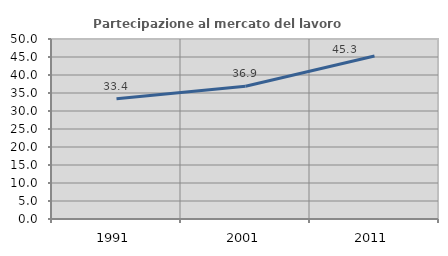
| Category | Partecipazione al mercato del lavoro  femminile |
|---|---|
| 1991.0 | 33.382 |
| 2001.0 | 36.862 |
| 2011.0 | 45.268 |